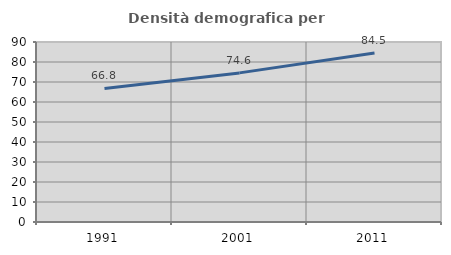
| Category | Densità demografica |
|---|---|
| 1991.0 | 66.796 |
| 2001.0 | 74.556 |
| 2011.0 | 84.532 |